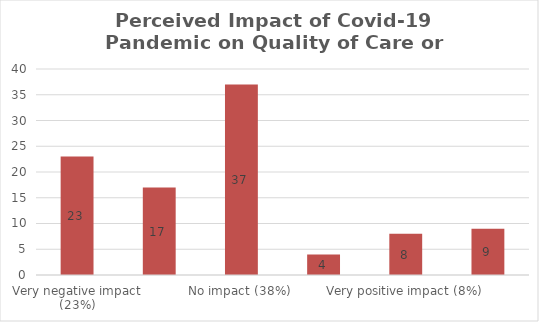
| Category | Series 0 | Series 1 |
|---|---|---|
| Very negative impact (23%) |  | 23 |
| Slightly negative impact (17%) |  | 17 |
| No impact (38%) |  | 37 |
| Slightly positive impact (4%) |  | 4 |
| Very positive impact (8%) |  | 8 |
| Not Known (9%) |  | 9 |